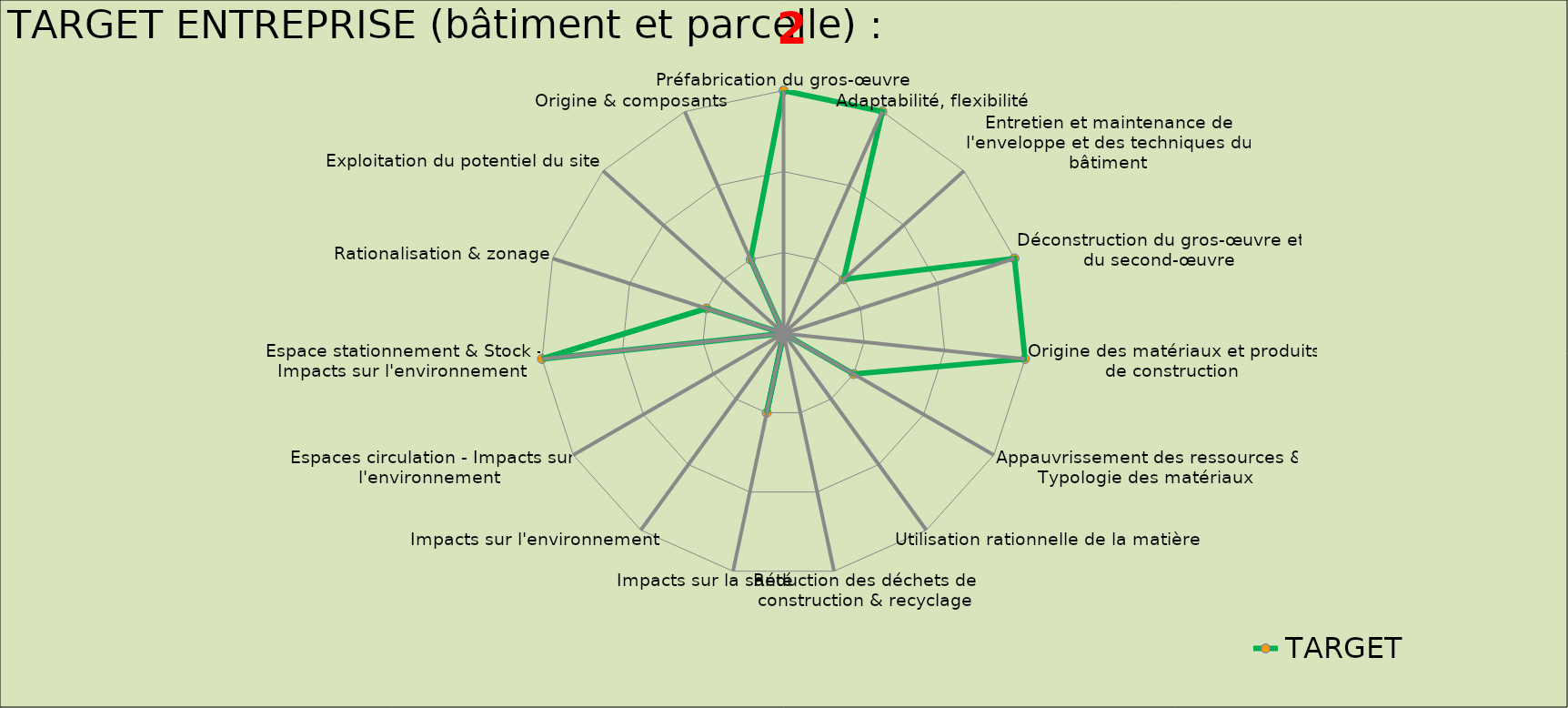
| Category | TARGET |
|---|---|
| Préfabrication du gros-œuvre | 3 |
| Adaptabilité, flexibilité | 3 |
| Entretien et maintenance de l'enveloppe et des techniques du bâtiment | 1 |
| Déconstruction du gros-œuvre et du second-œuvre | 3 |
| Origine des matériaux et produits de construction | 3 |
| Appauvrissement des ressources & Typologie des matériaux  | 1 |
| Utilisation rationnelle de la matière | 0 |
| Réduction des déchets de construction & recyclage | 0 |
| Impacts sur la santé  | 1 |
| Impacts sur l'environnement  | 0 |
| Espaces circulation - Impacts sur l'environnement  | 0 |
| Espace stationnement & Stock - Impacts sur l'environnement  | 3 |
| Rationalisation & zonage | 1 |
| Exploitation du potentiel du site | 0 |
| Origine & composants | 1 |